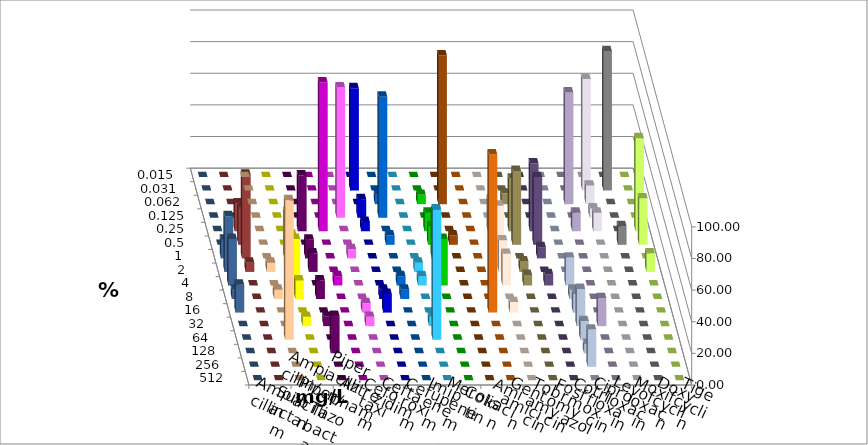
| Category | Ampicillin | Ampicillin/ Sulbactam | Piperacillin | Piperacillin/ Tazobactam | Aztreonam | Cefotaxim | Ceftazidim | Cefuroxim | Imipenem | Meropenem | Colistin | Amikacin | Gentamicin | Tobramycin | Fosfomycin | Cotrimoxazol | Ciprofloxacin | Levofloxacin | Moxifloxacin | Doxycyclin | Tigecyclin |
|---|---|---|---|---|---|---|---|---|---|---|---|---|---|---|---|---|---|---|---|---|---|
| 0.015 | 0 | 0 | 0 | 0 | 0 | 0 | 0 | 0 | 0 | 0 | 0 | 0 | 0 | 0 | 0 | 0 | 0 | 0 | 0 | 0 | 0 |
| 0.031 | 0 | 0 | 0 | 0 | 0 | 64.706 | 0 | 0 | 0 | 0 | 0 | 0 | 0 | 0 | 0 | 0 | 70.588 | 88.235 | 0 | 0 | 0 |
| 0.062 | 0 | 0 | 0 | 0 | 0 | 0 | 5.882 | 0 | 5.882 | 94.118 | 0 | 0 | 6.667 | 0 | 0 | 70.588 | 11.765 | 0 | 0 | 0 | 0 |
| 0.125 | 0 | 0 | 0 | 0 | 82.353 | 11.765 | 76.471 | 0 | 0 | 0 | 0 | 0 | 0 | 0 | 0 | 0 | 5.882 | 0 | 0 | 0 | 0 |
| 0.25 | 0 | 0 | 35.294 | 94.118 | 0 | 5.882 | 0 | 0 | 11.765 | 0 | 0 | 20 | 33.333 | 42.857 | 0 | 11.765 | 11.765 | 0 | 58.824 | 0 | 17.647 |
| 0.5 | 0 | 0 | 0 | 0 | 0 | 0 | 5.882 | 0 | 11.765 | 5.882 | 0 | 0 | 46.667 | 42.857 | 0 | 0 | 0 | 11.765 | 29.412 | 0 | 23.529 |
| 1.0 | 0 | 29.412 | 11.765 | 0 | 5.882 | 0 | 0 | 0 | 29.412 | 0 | 0 | 33.333 | 0 | 7.143 | 0 | 0 | 0 | 0 | 0 | 11.765 | 52.941 |
| 2.0 | 5.882 | 23.529 | 11.765 | 0 | 0 | 0 | 0 | 5.882 | 11.765 | 0 | 0 | 20 | 6.667 | 0 | 0 | 0 | 0 | 0 | 11.765 | 35.294 | 5.882 |
| 4.0 | 0 | 29.412 | 0 | 5.882 | 0 | 0 | 5.882 | 5.882 | 29.412 | 0 | 0 | 20 | 6.667 | 7.143 | 17.647 | 0 | 0 | 0 | 0 | 29.412 | 0 |
| 8.0 | 5.882 | 11.765 | 11.765 | 0 | 0 | 5.882 | 5.882 | 0 | 0 | 0 | 0 | 0 | 0 | 0 | 5.882 | 0 | 0 | 0 | 0 | 5.882 | 0 |
| 16.0 | 0 | 0 | 0 | 0 | 5.882 | 11.765 | 0 | 0 | 0 | 0 | 100 | 6.667 | 0 | 0 | 11.765 | 0 | 0 | 0 | 0 | 17.647 | 0 |
| 32.0 | 0 | 5.882 | 5.882 | 0 | 5.882 | 0 | 0 | 5.882 | 0 | 0 | 0 | 0 | 0 | 0 | 23.529 | 17.647 | 0 | 0 | 0 | 0 | 0 |
| 64.0 | 88.235 | 0 | 0 | 0 | 0 | 0 | 0 | 82.353 | 0 | 0 | 0 | 0 | 0 | 0 | 11.765 | 0 | 0 | 0 | 0 | 0 | 0 |
| 128.0 | 0 | 0 | 23.529 | 0 | 0 | 0 | 0 | 0 | 0 | 0 | 0 | 0 | 0 | 0 | 5.882 | 0 | 0 | 0 | 0 | 0 | 0 |
| 256.0 | 0 | 0 | 0 | 0 | 0 | 0 | 0 | 0 | 0 | 0 | 0 | 0 | 0 | 0 | 23.529 | 0 | 0 | 0 | 0 | 0 | 0 |
| 512.0 | 0 | 0 | 0 | 0 | 0 | 0 | 0 | 0 | 0 | 0 | 0 | 0 | 0 | 0 | 0 | 0 | 0 | 0 | 0 | 0 | 0 |